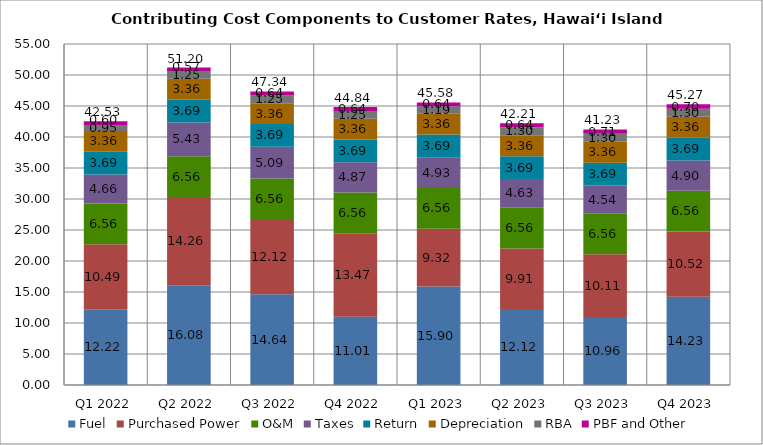
| Category | Fuel | Purchased Power | O&M | Taxes | Return | Depreciation | RBA | PBF and Other | Total |
|---|---|---|---|---|---|---|---|---|---|
| Q1 2022 | 12.224 | 10.486 | 6.564 | 4.661 | 3.689 | 3.356 | 0.946 | 0.602 | 42.527 |
| Q2 2022 | 16.082 | 14.256 | 6.564 | 5.431 | 3.689 | 3.356 | 1.249 | 0.572 | 51.198 |
| Q3 2022 | 14.64 | 12.116 | 6.564 | 5.087 | 3.689 | 3.356 | 1.249 | 0.64 | 47.342 |
| Q4 2022 | 11.008 | 13.472 | 6.564 | 4.865 | 3.689 | 3.356 | 1.249 | 0.638 | 44.841 |
| Q1 2023 | 15.901 | 9.318 | 6.564 | 4.931 | 3.689 | 3.356 | 1.185 | 0.639 | 45.584 |
| Q2 2023 | 12.116 | 9.907 | 6.564 | 4.631 | 3.689 | 3.356 | 1.303 | 0.641 | 42.206 |
| Q3 2023 | 10.96 | 10.109 | 6.564 | 4.543 | 3.689 | 3.356 | 1.303 | 0.706 | 41.23 |
| Q4 2023 | 14.225 | 10.522 | 6.564 | 4.901 | 3.689 | 3.356 | 1.303 | 0.704 | 45.265 |